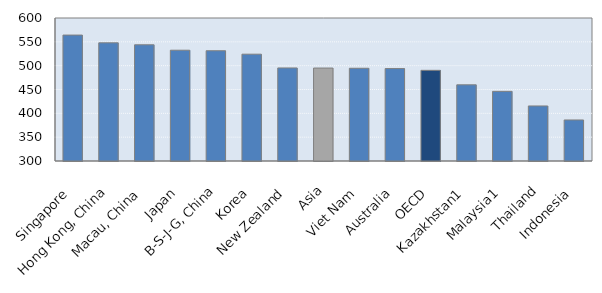
| Category | 2015 mean scores in mathematics |
|---|---|
| Singapore | 564.19 |
| Hong Kong, China | 547.931 |
| Macau, China | 543.808 |
| Japan | 532.44 |
| B-S-J-G, China | 531.296 |
| Korea | 524.106 |
| New Zealand | 495.223 |
| Asia | 494.993 |
| Viet Nam | 494.518 |
| Australia | 493.896 |
| OECD | 490.204 |
| Kazakhstan1 | 459.816 |
| Malaysia1 | 446.11 |
| Thailand | 415.464 |
| Indonesia | 386.11 |